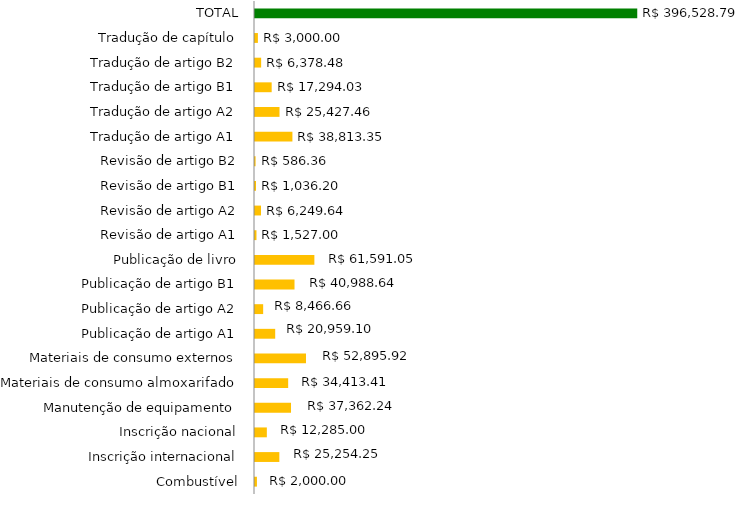
| Category | Series 1 |
|---|---|
| Combustível | 2000 |
| Inscrição internacional | 25254.25 |
| Inscrição nacional | 12285 |
| Manutenção de equipamento | 37362.24 |
| Materiais de consumo almoxarifado | 34413.41 |
| Materiais de consumo externos | 52895.92 |
| Publicação de artigo A1 | 20959.1 |
| Publicação de artigo A2 | 8466.66 |
| Publicação de artigo B1 | 40988.64 |
| Publicação de livro | 61591.05 |
| Revisão de artigo A1 | 1527 |
| Revisão de artigo A2 | 6249.64 |
| Revisão de artigo B1 | 1036.2 |
| Revisão de artigo B2 | 586.36 |
| Tradução de artigo A1 | 38813.35 |
| Tradução de artigo A2 | 25427.46 |
| Tradução de artigo B1 | 17294.03 |
| Tradução de artigo B2 | 6378.48 |
| Tradução de capítulo | 3000 |
| TOTAL | 396528.79 |